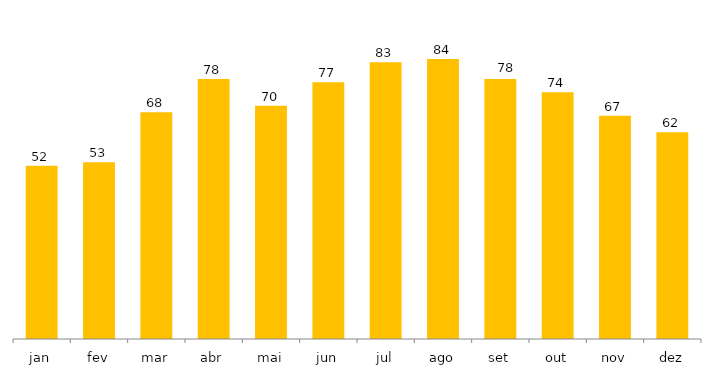
| Category | Total Geral |
|---|---|
| jan | 52 |
| fev | 53 |
| mar | 68 |
| abr | 78 |
| mai | 70 |
| jun | 77 |
| jul | 83 |
| ago | 84 |
| set | 78 |
| out | 74 |
| nov | 67 |
| dez | 62 |